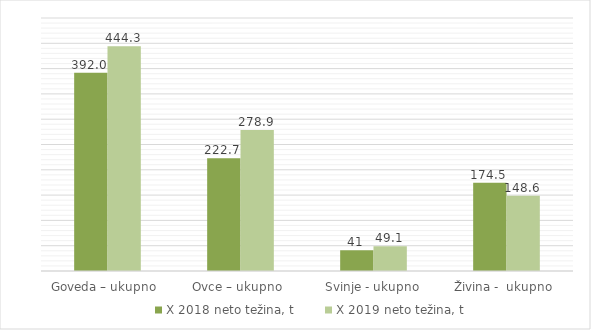
| Category | X 2018 | X 2019 |
|---|---|---|
| Goveda – ukupno  | 392 | 444.3 |
| Ovce – ukupno  | 222.7 | 278.9 |
| Svinje - ukupno | 41 | 49.1 |
| Živina -  ukupno  | 174.5 | 148.6 |